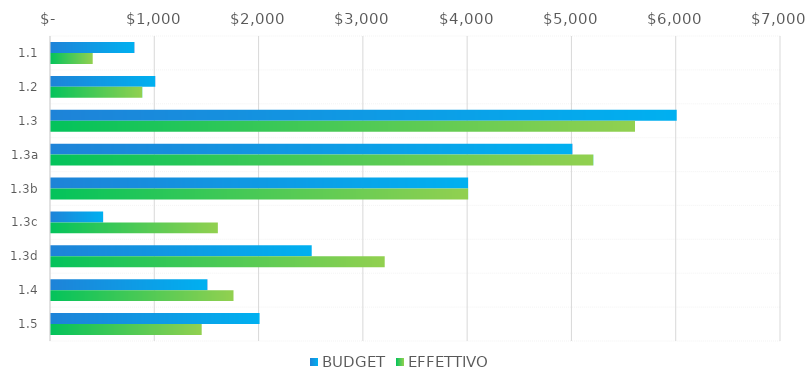
| Category | BUDGET | EFFETTIVO |
|---|---|---|
| 1.1 | 800 | 400 |
| 1.2 | 1000 | 875 |
| 1.3 | 6000 | 5600 |
| 1.3a | 5000 | 5200 |
| 1.3b | 4000 | 4000 |
| 1.3c | 500 | 1600 |
| 1.3d | 2500 | 3200 |
| 1.4 | 1500 | 1750 |
| 1.5 | 2000 | 1445 |